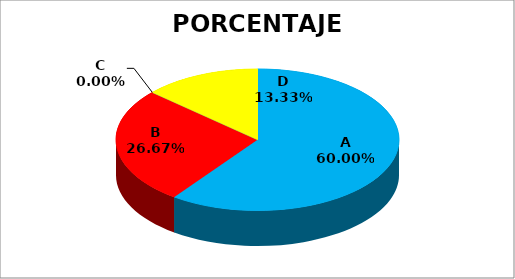
| Category | Series 0 |
|---|---|
| A | 9 |
| B | 4 |
| C | 0 |
| D | 2 |